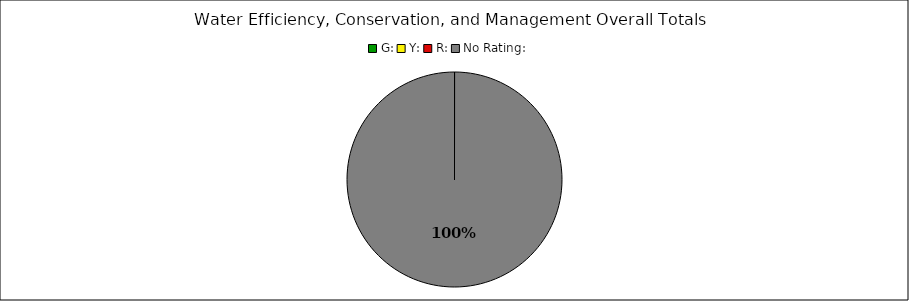
| Category | Series 0 |
|---|---|
| G: | 0 |
| Y: | 0 |
| R: | 0 |
| No Rating: | 5 |